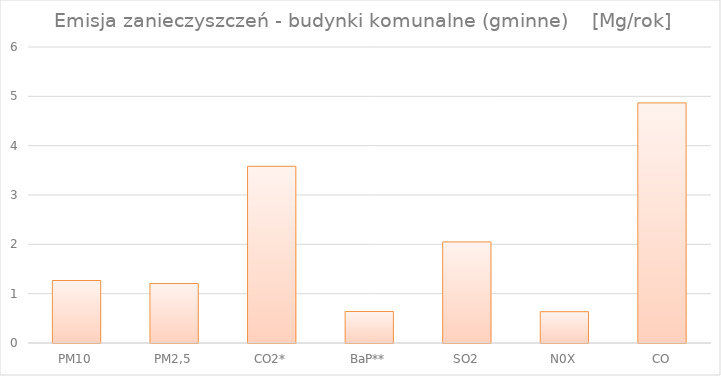
| Category | Series 0 |
|---|---|
| PM10 | 1.267 |
| PM2,5 | 1.206 |
| CO2* | 3.582 |
| BaP** | 0.639 |
| SO2 | 2.049 |
| N0X | 0.635 |
| CO | 4.867 |